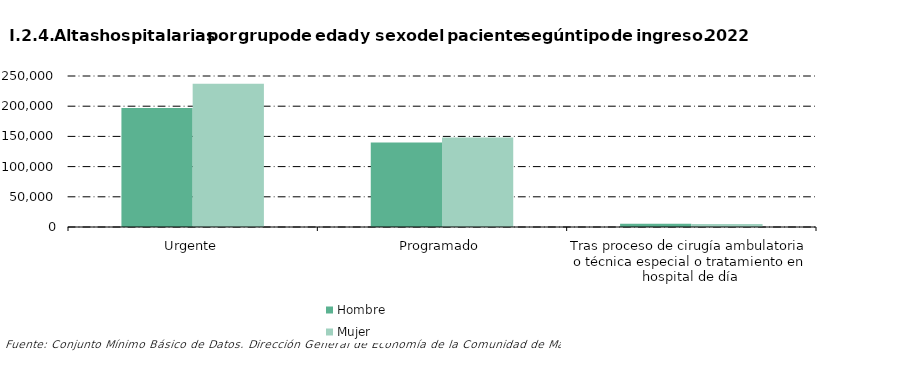
| Category |     Hombre |     Mujer |
|---|---|---|
| 0 | 196872 | 237170 |
| 1 | 140056 | 148065 |
| 2 | 5207 | 5030 |